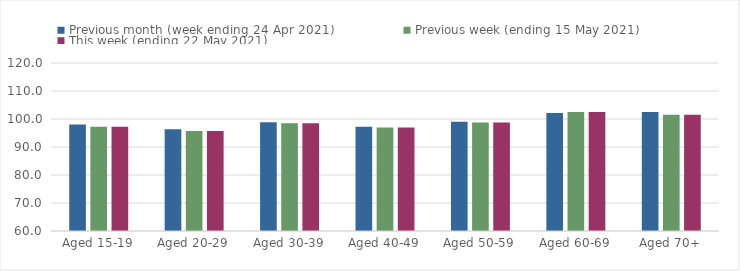
| Category | Previous month (week ending 24 Apr 2021) | Previous week (ending 15 May 2021) | This week (ending 22 May 2021) |
|---|---|---|---|
| Aged 15-19 | 98.01 | 97.19 | 97.19 |
| Aged 20-29 | 96.32 | 95.68 | 95.68 |
| Aged 30-39 | 98.88 | 98.52 | 98.52 |
| Aged 40-49 | 97.25 | 96.92 | 96.92 |
| Aged 50-59 | 99.06 | 98.75 | 98.75 |
| Aged 60-69 | 102.14 | 102.47 | 102.47 |
| Aged 70+ | 102.49 | 101.49 | 101.49 |